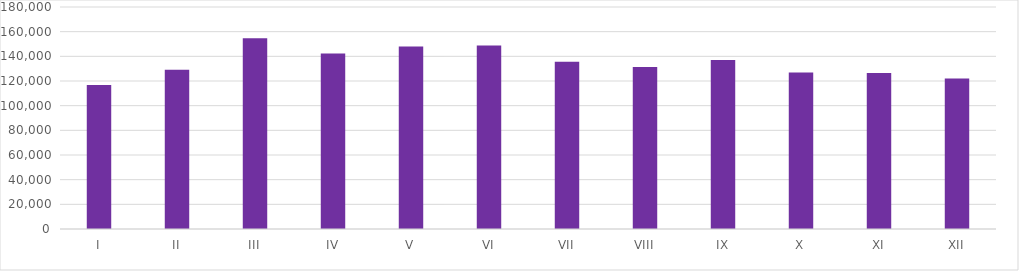
| Category | Series 0 |
|---|---|
| I | 116785 |
| II | 129092 |
| III | 154626 |
| IV | 142196 |
| V | 147888 |
| VI | 148873 |
| VII | 135515 |
| VIII | 131251 |
| IX | 137006 |
| X | 126879 |
| XI | 126389 |
| XII | 121959 |